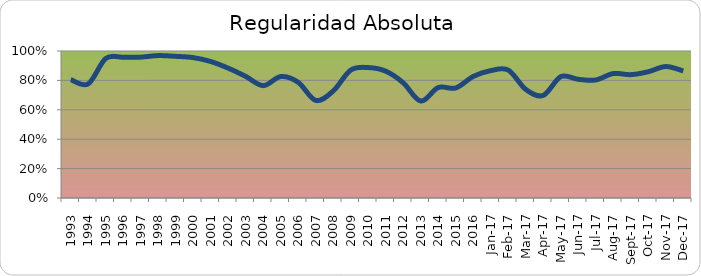
| Category | Series 0 |
|---|---|
| 1993.0 | 0.805 |
| 1994.0 | 0.776 |
| 1995.0 | 0.949 |
| 1996.0 | 0.958 |
| 1997.0 | 0.958 |
| 1998.0 | 0.969 |
| 1999.0 | 0.964 |
| 2000.0 | 0.955 |
| 2001.0 | 0.929 |
| 2002.0 | 0.883 |
| 2003.0 | 0.827 |
| 2004.0 | 0.764 |
| 2005.0 | 0.826 |
| 2006.0 | 0.787 |
| 2007.0 | 0.664 |
| 2008.0 | 0.728 |
| 2009.0 | 0.87 |
| 2010.0 | 0.887 |
| 2011.0 | 0.863 |
| 2012.0 | 0.783 |
| 2013.0 | 0.66 |
| 2014.0 | 0.751 |
| 2015.0 | 0.749 |
| 2016.0 | 0.827 |
| 42736.0 | 0.866 |
| 42767.0 | 0.87 |
| 42795.0 | 0.739 |
| 42826.0 | 0.698 |
| 42856.0 | 0.825 |
| 42887.0 | 0.807 |
| 42917.0 | 0.803 |
| 42948.0 | 0.847 |
| 42979.0 | 0.839 |
| 43009.0 | 0.859 |
| 43040.0 | 0.894 |
| 43070.0 | 0.864 |